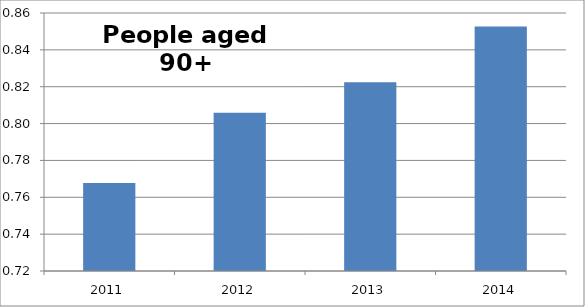
| Category | Series 0 |
|---|---|
| 2011 | 0.768 |
| 2012 | 0.806 |
| 2013 | 0.822 |
| 2014 | 0.853 |